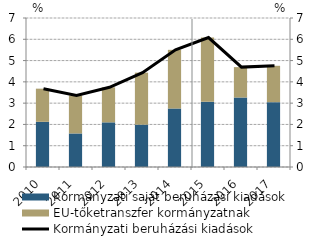
| Category | Kormányzati saját beruházási kiadások | EU-tőketranszfer kormányzatnak |
|---|---|---|
| 2010.0 | 2.123 | 1.557 |
| 2011.0 | 1.576 | 1.786 |
| 2012.0 | 2.098 | 1.645 |
| 2013.0 | 1.99 | 2.443 |
| 2014.0 | 2.749 | 2.755 |
| 2015.0 | 3.068 | 3.014 |
| 2016.0 | 3.266 | 1.427 |
| 2017.0 | 3.048 | 1.707 |